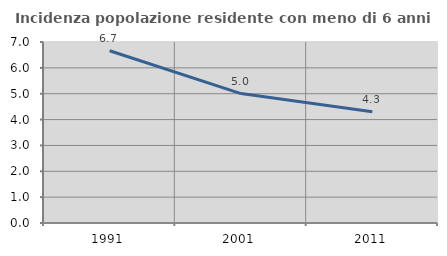
| Category | Incidenza popolazione residente con meno di 6 anni |
|---|---|
| 1991.0 | 6.661 |
| 2001.0 | 5.005 |
| 2011.0 | 4.304 |